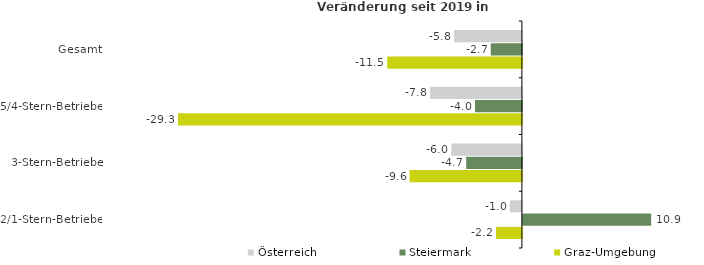
| Category | Österreich | Steiermark | Graz-Umgebung |
|---|---|---|---|
| Gesamt | -5.779 | -2.653 | -11.475 |
| 5/4-Stern-Betriebe | -7.825 | -3.996 | -29.294 |
| 3-Stern-Betriebe | -6.014 | -4.748 | -9.566 |
| 2/1-Stern-Betriebe | -1.021 | 10.926 | -2.199 |